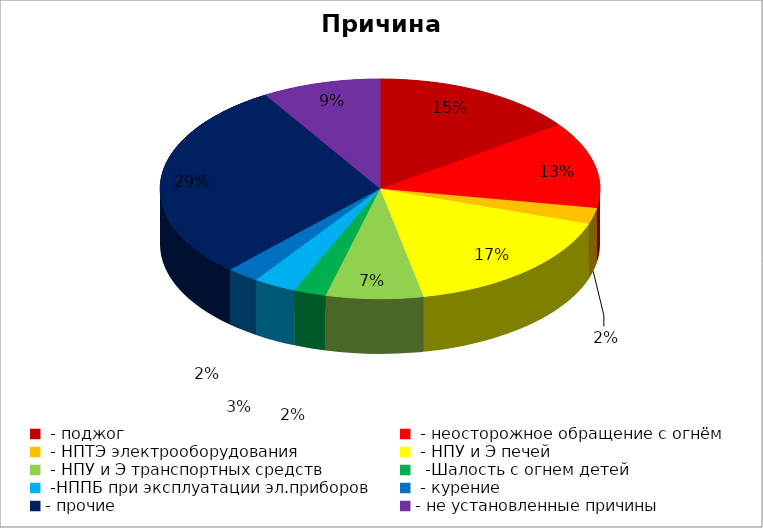
| Category | Причина пожара |
|---|---|
|  - поджог | 19 |
|  - неосторожное обращение с огнём | 16 |
|  - НПТЭ электрооборудования | 3 |
|  - НПУ и Э печей | 21 |
|  - НПУ и Э транспортных средств | 9 |
|   -Шалость с огнем детей | 3 |
|  -НППБ при эксплуатации эл.приборов | 4 |
|  - курение | 3 |
| - прочие | 37 |
| - не установленные причины | 11 |